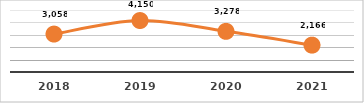
| Category | SERVICIOS TECNOLÓGICOS PROPORCIONADOS
PRIMER TRIMESTRE, EJERCICIO 2021 |
|---|---|
| 2018.0 | 3058 |
| 2019.0 | 4150 |
| 2020.0 | 3278 |
| 2021.0 | 2166 |